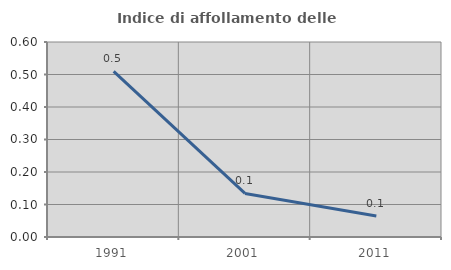
| Category | Indice di affollamento delle abitazioni  |
|---|---|
| 1991.0 | 0.51 |
| 2001.0 | 0.134 |
| 2011.0 | 0.064 |